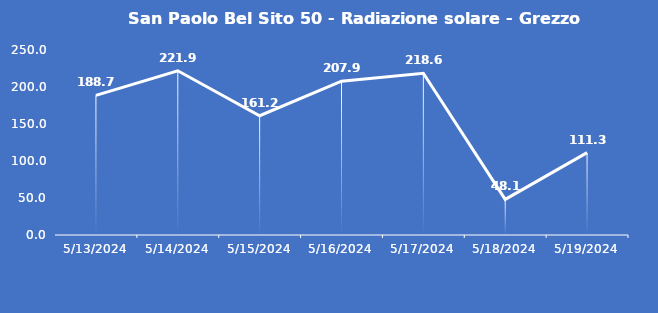
| Category | San Paolo Bel Sito 50 - Radiazione solare - Grezzo (W/m2) |
|---|---|
| 5/13/24 | 188.7 |
| 5/14/24 | 221.9 |
| 5/15/24 | 161.2 |
| 5/16/24 | 207.9 |
| 5/17/24 | 218.6 |
| 5/18/24 | 48.1 |
| 5/19/24 | 111.3 |